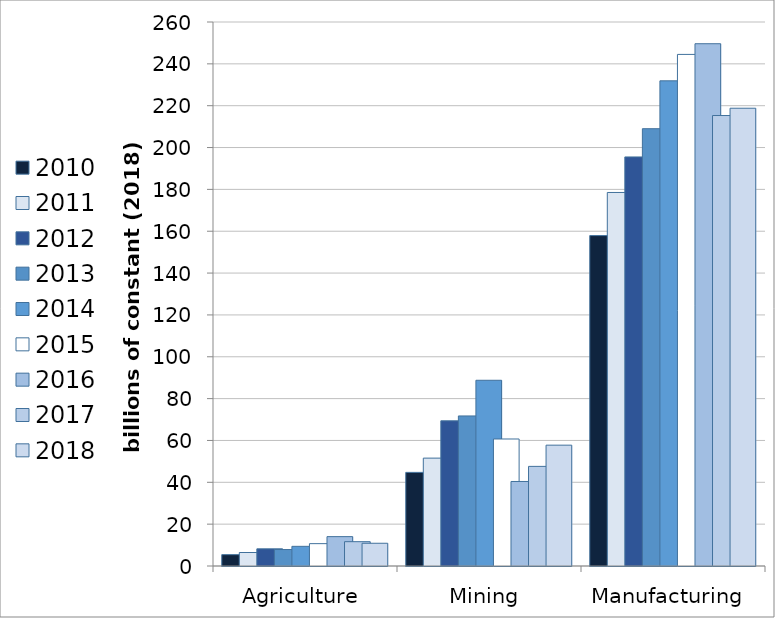
| Category | 2010 | 2011 | 2012 | 2013 | 2014 | 2015 | 2016 | 2017 | 2018 |
|---|---|---|---|---|---|---|---|---|---|
| Agriculture | 5.421 | 6.445 | 8.21 | 7.865 | 9.399 | 10.679 | 14.037 | 11.626 | 10.869 |
| Mining | 44.741 | 51.561 | 69.39 | 71.717 | 88.765 | 60.706 | 40.397 | 47.61 | 57.75 |
| Manufacturing | 157.915 | 178.519 | 195.507 | 209.007 | 231.888 | 244.506 | 249.615 | 215.303 | 218.788 |